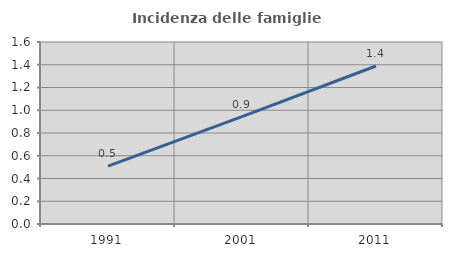
| Category | Incidenza delle famiglie numerose |
|---|---|
| 1991.0 | 0.509 |
| 2001.0 | 0.943 |
| 2011.0 | 1.389 |